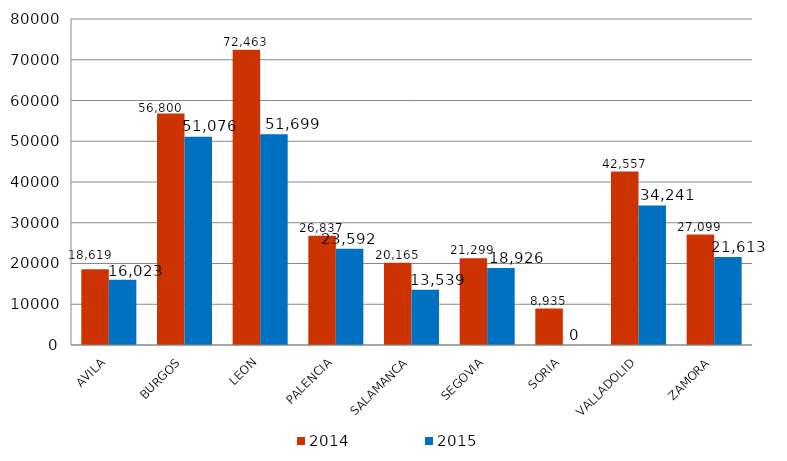
| Category | 2014 | 2015 |
|---|---|---|
| AVILA | 18619 | 16023 |
| BURGOS | 56800 | 51076 |
| LEON | 72463 | 51699 |
| PALENCIA | 26837 | 23592 |
| SALAMANCA | 20165 | 13539 |
| SEGOVIA | 21299 | 18926 |
| SORIA | 8935 | 0 |
| VALLADOLID | 42557 | 34241 |
| ZAMORA | 27099 | 21613 |